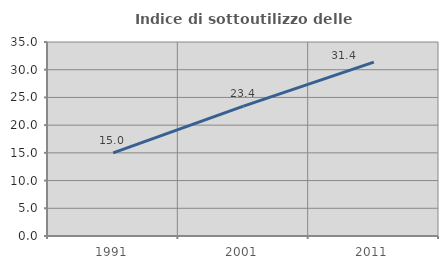
| Category | Indice di sottoutilizzo delle abitazioni  |
|---|---|
| 1991.0 | 14.991 |
| 2001.0 | 23.436 |
| 2011.0 | 31.376 |